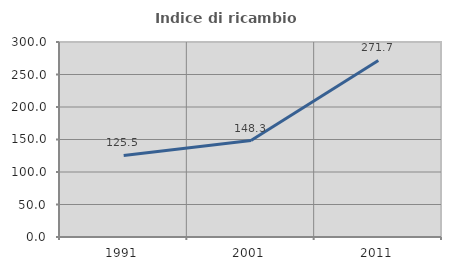
| Category | Indice di ricambio occupazionale  |
|---|---|
| 1991.0 | 125.532 |
| 2001.0 | 148.333 |
| 2011.0 | 271.698 |